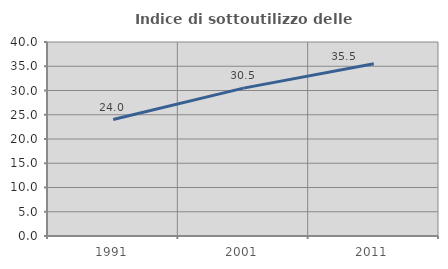
| Category | Indice di sottoutilizzo delle abitazioni  |
|---|---|
| 1991.0 | 24.011 |
| 2001.0 | 30.485 |
| 2011.0 | 35.532 |